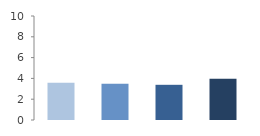
| Category | Rate (%) |
|---|---|
| 2009.0 | 3.577 |
| 2010.0 | 3.486 |
| 2011.0 | 3.384 |
| 2012.0 | 3.968 |